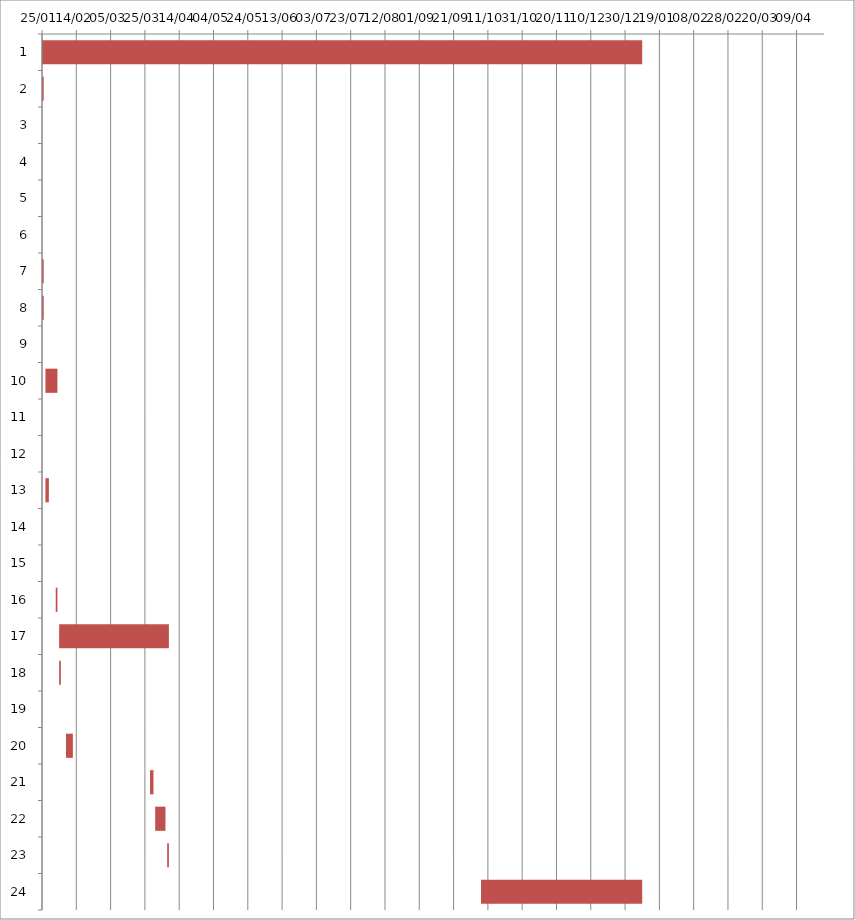
| Category | Fecha de inicio | DURACIÓN |
|---|---|---|
| 0 | 1/25/16 | 350 |
| 1 | 1/25/16 | 1 |
| 2 | 1/25/16 | 0 |
| 3 | 1/25/16 | 0 |
| 4 | 1/25/16 | 0 |
| 5 | 1/25/16 | 0 |
| 6 | 1/25/16 | 1 |
| 7 | 1/25/16 | 1 |
| 8 | 1/26/16 | 0 |
| 9 | 1/27/16 | 7 |
| 10 | 1/27/16 | 0 |
| 11 | 1/28/16 | 0 |
| 12 | 1/27/16 | 2 |
| 13 | 2/1/16 | 0 |
| 14 | 2/2/16 | 0 |
| 15 | 2/2/16 | 1 |
| 16 | 2/4/16 | 64 |
| 17 | 2/4/16 | 1 |
| 18 | 2/5/16 | 0 |
| 19 | 2/8/16 | 4 |
| 20 | 3/28/16 | 2 |
| 21 | 3/31/16 | 6 |
| 22 | 4/7/16 | 1 |
| 23 | 10/7/16 | 94 |